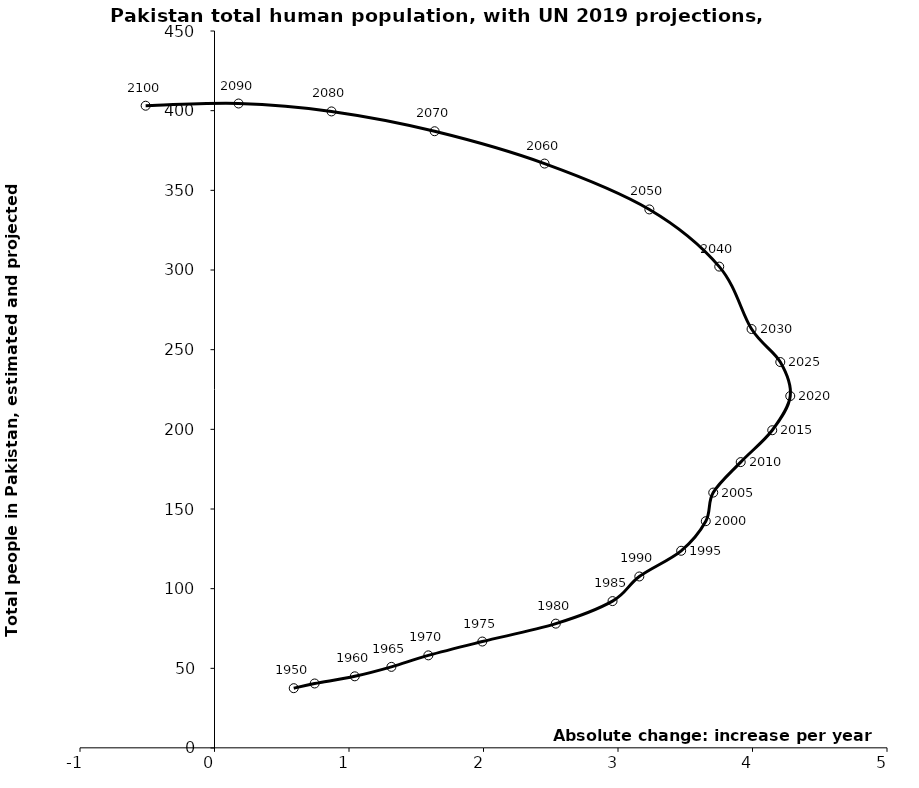
| Category | Series 0 |
|---|---|
| 0.5891307999999995 | 37.542 |
| 0.7446314000000036 | 40.488 |
| 1.0429944999999996 | 44.989 |
| 1.3153369999999989 | 50.918 |
| 1.5898902000000028 | 58.142 |
| 1.9912283000000024 | 66.817 |
| 2.5374632999999975 | 78.054 |
| 2.9593577999999923 | 92.192 |
| 3.1585329 | 107.648 |
| 3.4695657000000097 | 123.777 |
| 3.652716899999999 | 142.344 |
| 3.7081063 | 160.304 |
| 3.9122956000000015 | 179.425 |
| 4.146769900000004 | 199.427 |
| 4.280709200000007 | 220.892 |
| 4.206645400000002 | 242.234 |
| 3.9930091333333357 | 262.959 |
| 3.752720099999985 | 302.129 |
| 3.2331591499999943 | 338.013 |
| 2.454047950000009 | 366.792 |
| 1.636548899999991 | 387.094 |
| 0.8698286999999993 | 399.523 |
| 0.17897365000000037 | 404.491 |
| -0.5118813999999987 | 403.103 |